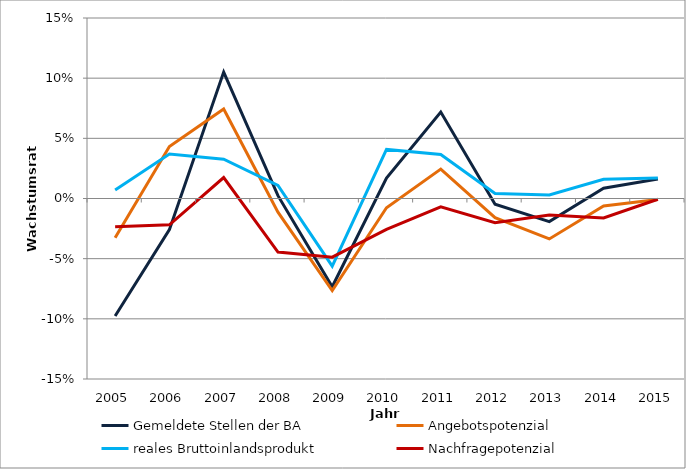
| Category | Gemeldete Stellen der BA | Angebotspotenzial | reales Bruttoinlandsprodukt | Nachfragepotenzial |
|---|---|---|---|---|
| 2005.0 | -0.098 | -0.033 | 0.007 | -0.023 |
| 2006.0 | -0.026 | 0.043 | 0.037 | -0.022 |
| 2007.0 | 0.105 | 0.074 | 0.033 | 0.017 |
| 2008.0 | 0.002 | -0.011 | 0.011 | -0.044 |
| 2009.0 | -0.073 | -0.076 | -0.056 | -0.049 |
| 2010.0 | 0.017 | -0.008 | 0.041 | -0.026 |
| 2011.0 | 0.072 | 0.024 | 0.037 | -0.007 |
| 2012.0 | -0.005 | -0.016 | 0.004 | -0.02 |
| 2013.0 | -0.019 | -0.034 | 0.003 | -0.014 |
| 2014.0 | 0.009 | -0.006 | 0.016 | -0.016 |
| 2015.0 | 0.016 | -0.001 | 0.017 | -0.001 |